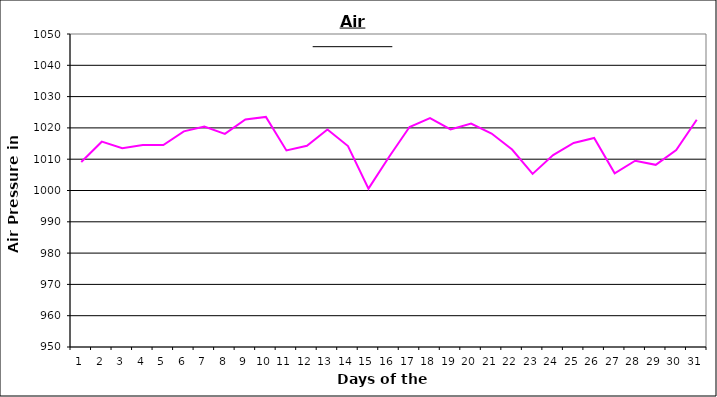
| Category | Series 0 |
|---|---|
| 0 | 1009.1 |
| 1 | 1015.6 |
| 2 | 1013.5 |
| 3 | 1014.5 |
| 4 | 1014.5 |
| 5 | 1018.9 |
| 6 | 1020.4 |
| 7 | 1018.1 |
| 8 | 1022.7 |
| 9 | 1023.5 |
| 10 | 1012.8 |
| 11 | 1014.3 |
| 12 | 1019.5 |
| 13 | 1014.2 |
| 14 | 1000.6 |
| 15 | 1010.7 |
| 16 | 1020.3 |
| 17 | 1023.1 |
| 18 | 1019.5 |
| 19 | 1021.4 |
| 20 | 1018.2 |
| 21 | 1013.1 |
| 22 | 1005.3 |
| 23 | 1011.3 |
| 24 | 1015.2 |
| 25 | 1016.8 |
| 26 | 1005.5 |
| 27 | 1009.5 |
| 28 | 1008.2 |
| 29 | 1012.9 |
| 30 | 1022.6 |